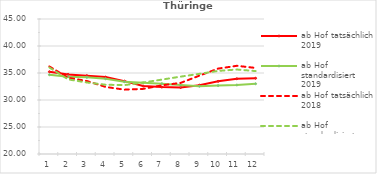
| Category | ab Hof tatsächlich 2019 | ab Hof standardisiert 2019 | ab Hof tatsächlich 2018 | ab Hof standardisiert 2018 |
|---|---|---|---|---|
| 0 | 35.236 | 34.676 | 36.215 | 36.02 |
| 1 | 34.743 | 34.305 | 34.118 | 33.819 |
| 2 | 34.507 | 34.194 | 33.518 | 33.242 |
| 3 | 34.241 | 33.93 | 32.422 | 32.827 |
| 4 | 33.493 | 33.387 | 31.917 | 32.753 |
| 5 | 32.579 | 33.179 | 32.059 | 33.232 |
| 6 | 32.385 | 33.028 | 32.717 | 33.779 |
| 7 | 32.32 | 32.769 | 33.165 | 34.328 |
| 8 | 32.746 | 32.554 | 34.509 | 34.842 |
| 9 | 33.457 | 32.67 | 35.815 | 35.387 |
| 10 | 33.928 | 32.775 | 36.333 | 35.645 |
| 11 | 34.026 | 33.005 | 35.937 | 35.356 |